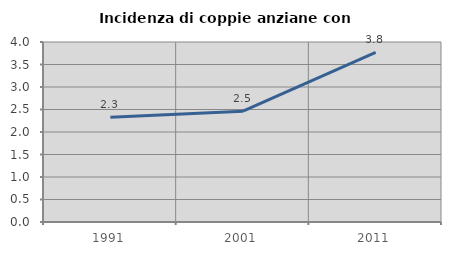
| Category | Incidenza di coppie anziane con figli |
|---|---|
| 1991.0 | 2.33 |
| 2001.0 | 2.463 |
| 2011.0 | 3.769 |